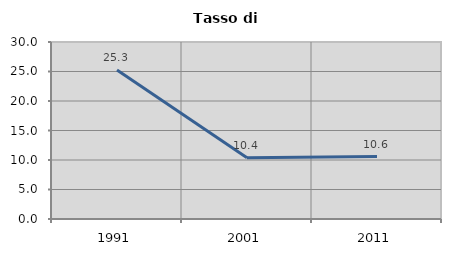
| Category | Tasso di disoccupazione   |
|---|---|
| 1991.0 | 25.263 |
| 2001.0 | 10.392 |
| 2011.0 | 10.59 |